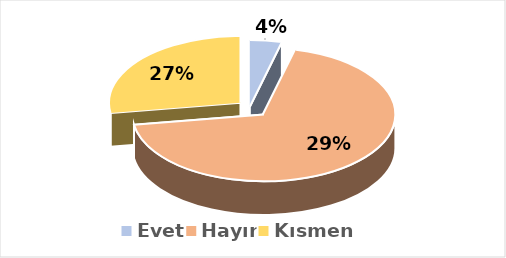
| Category | Evet |
|---|---|
| Evet | 0.039 |
| Hayır | 0.686 |
| Kısmen | 0.275 |